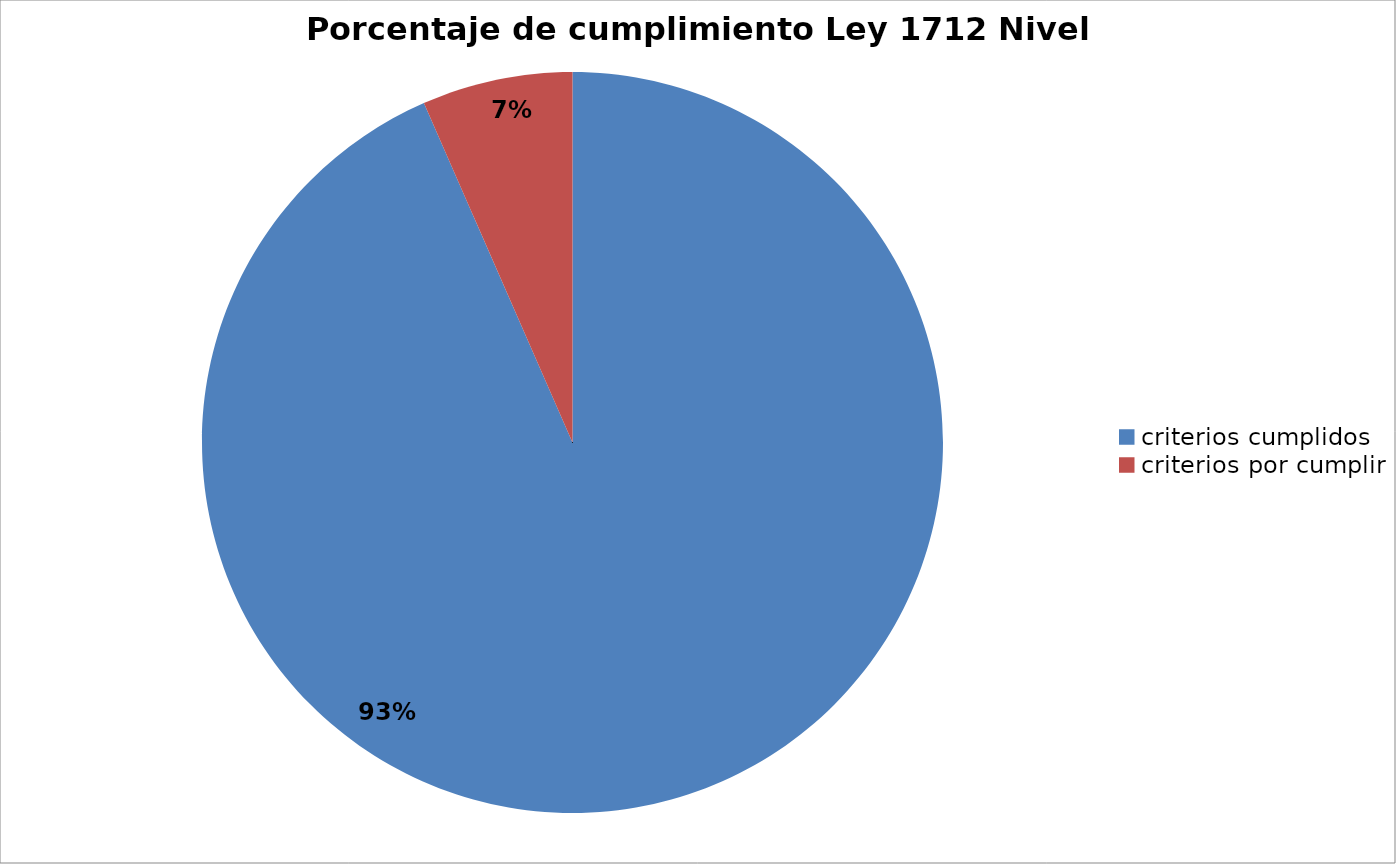
| Category | Series 0 |
|---|---|
| criterios cumplidos | 128 |
| criterios por cumplir | 9 |